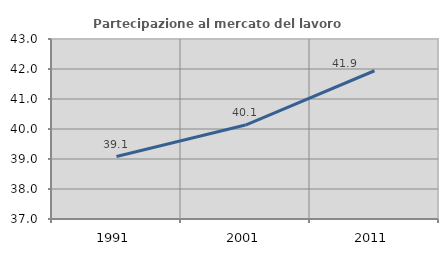
| Category | Partecipazione al mercato del lavoro  femminile |
|---|---|
| 1991.0 | 39.083 |
| 2001.0 | 40.132 |
| 2011.0 | 41.941 |